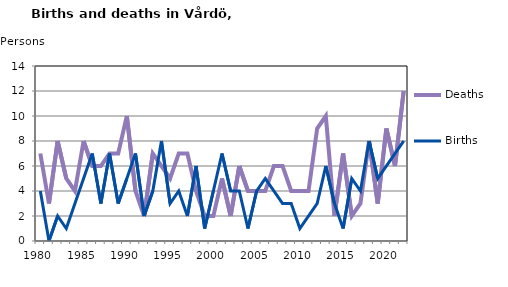
| Category | Deaths | Births |
|---|---|---|
| 1980.0 | 7 | 4 |
| 1981.0 | 3 | 0 |
| 1982.0 | 8 | 2 |
| 1983.0 | 5 | 1 |
| 1984.0 | 4 | 3 |
| 1985.0 | 8 | 5 |
| 1986.0 | 6 | 7 |
| 1987.0 | 6 | 3 |
| 1988.0 | 7 | 7 |
| 1989.0 | 7 | 3 |
| 1990.0 | 10 | 5 |
| 1991.0 | 4 | 7 |
| 1992.0 | 2 | 2 |
| 1993.0 | 7 | 4 |
| 1994.0 | 6 | 8 |
| 1995.0 | 5 | 3 |
| 1996.0 | 7 | 4 |
| 1997.0 | 7 | 2 |
| 1998.0 | 4 | 6 |
| 1999.0 | 2 | 1 |
| 2000.0 | 2 | 4 |
| 2001.0 | 5 | 7 |
| 2002.0 | 2 | 4 |
| 2003.0 | 6 | 4 |
| 2004.0 | 4 | 1 |
| 2005.0 | 4 | 4 |
| 2006.0 | 4 | 5 |
| 2007.0 | 6 | 4 |
| 2008.0 | 6 | 3 |
| 2009.0 | 4 | 3 |
| 2010.0 | 4 | 1 |
| 2011.0 | 4 | 2 |
| 2012.0 | 9 | 3 |
| 2013.0 | 10 | 6 |
| 2014.0 | 2 | 3 |
| 2015.0 | 7 | 1 |
| 2016.0 | 2 | 5 |
| 2017.0 | 3 | 4 |
| 2018.0 | 8 | 8 |
| 2019.0 | 3 | 5 |
| 2020.0 | 9 | 6 |
| 2021.0 | 6 | 7 |
| 2022.0 | 12 | 8 |